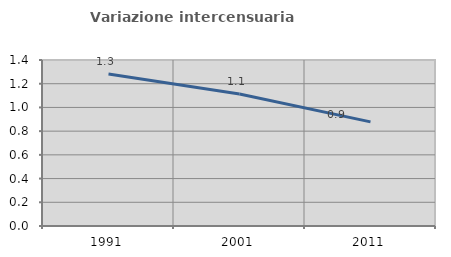
| Category | Variazione intercensuaria annua |
|---|---|
| 1991.0 | 1.281 |
| 2001.0 | 1.114 |
| 2011.0 | 0.878 |